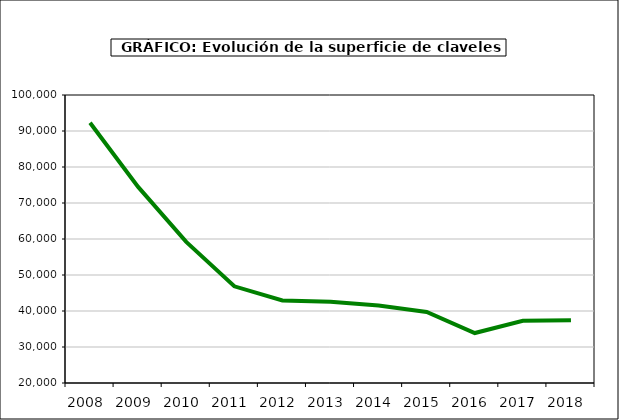
| Category | superficie |
|---|---|
| 2008.0 | 92310 |
| 2009.0 | 74481 |
| 2010.0 | 59199 |
| 2011.0 | 46860 |
| 2012.0 | 42920 |
| 2013.0 | 42572 |
| 2014.0 | 41501 |
| 2015.0 | 39713 |
| 2016.0 | 33880 |
| 2017.0 | 37286 |
| 2018.0 | 37444 |